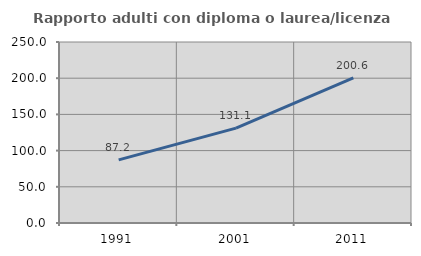
| Category | Rapporto adulti con diploma o laurea/licenza media  |
|---|---|
| 1991.0 | 87.18 |
| 2001.0 | 131.096 |
| 2011.0 | 200.581 |